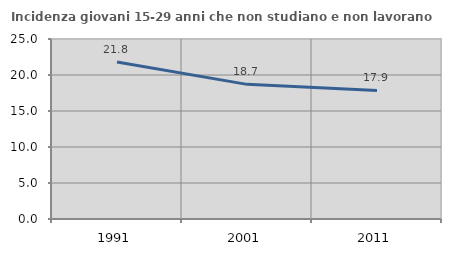
| Category | Incidenza giovani 15-29 anni che non studiano e non lavorano  |
|---|---|
| 1991.0 | 21.795 |
| 2001.0 | 18.699 |
| 2011.0 | 17.857 |